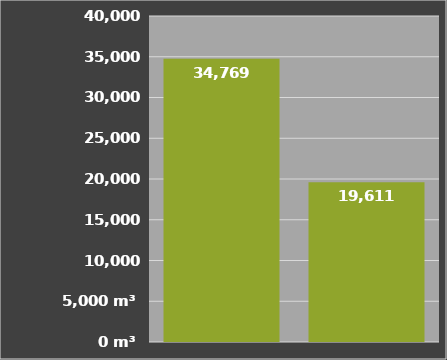
| Category | Güllemenge
im Frühjahr |
|---|---|
| Verschlauchung | 34768.612 |
| Güllewagen | 19611.429 |